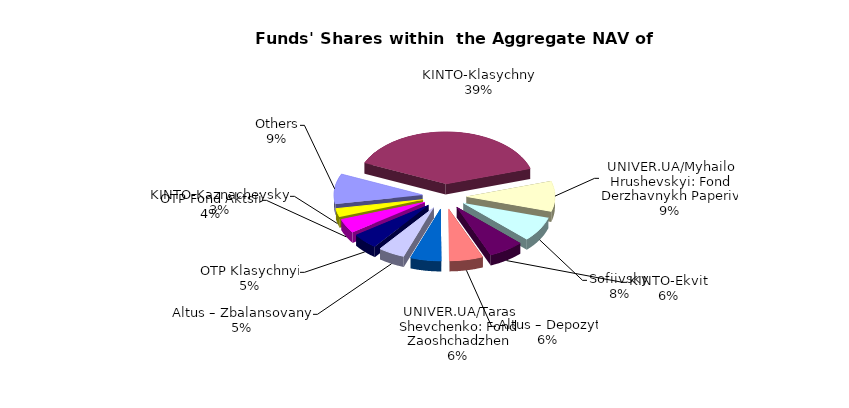
| Category | Series 0 | Series 1 |
|---|---|---|
| Others | 5272474.29 | 0.089 |
| KINTO-Klasychnyi | 21756347.8 | 0.367 |
| UNIVER.UA/Myhailo Hrushevskyi: Fond Derzhavnykh Paperiv | 5318417.68 | 0.09 |
| Sofiivskyi | 4318424.45 | 0.073 |
| KINTO-Ekviti | 3625362.08 | 0.061 |
| Altus – Depozyt | 3462262.67 | 0.058 |
| UNIVER.UA/Taras Shevchenko: Fond Zaoshchadzhen | 3167659.36 | 0.053 |
| Altus – Zbalansovanyi | 2750262.71 | 0.046 |
| ОТP Klasychnyi | 2718280.99 | 0.046 |
| OTP Fond Aktsii | 2457564.5 | 0.041 |
| KINTO-Kaznacheyskyi | 1493604.85 | 0.025 |